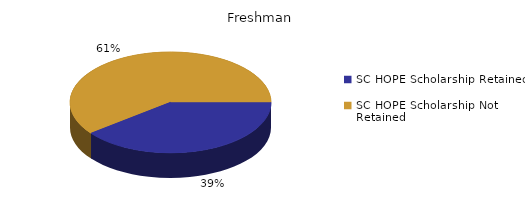
| Category | Freshman |
|---|---|
| SC HOPE Scholarship Retained  | 47 |
| SC HOPE Scholarship Not Retained  | 72 |